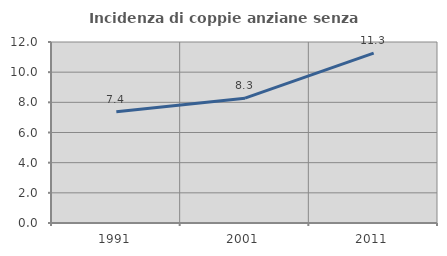
| Category | Incidenza di coppie anziane senza figli  |
|---|---|
| 1991.0 | 7.374 |
| 2001.0 | 8.274 |
| 2011.0 | 11.263 |